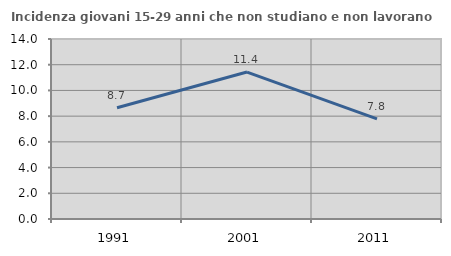
| Category | Incidenza giovani 15-29 anni che non studiano e non lavorano  |
|---|---|
| 1991.0 | 8.654 |
| 2001.0 | 11.429 |
| 2011.0 | 7.792 |